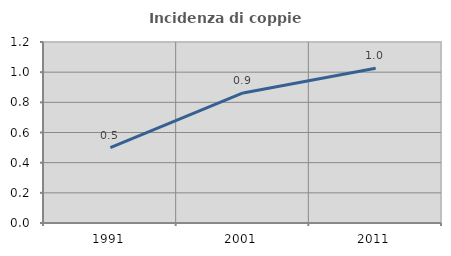
| Category | Incidenza di coppie miste |
|---|---|
| 1991.0 | 0.5 |
| 2001.0 | 0.862 |
| 2011.0 | 1.026 |